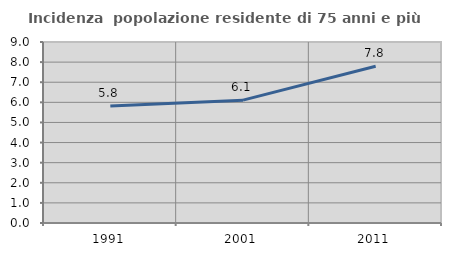
| Category | Incidenza  popolazione residente di 75 anni e più |
|---|---|
| 1991.0 | 5.814 |
| 2001.0 | 6.107 |
| 2011.0 | 7.796 |